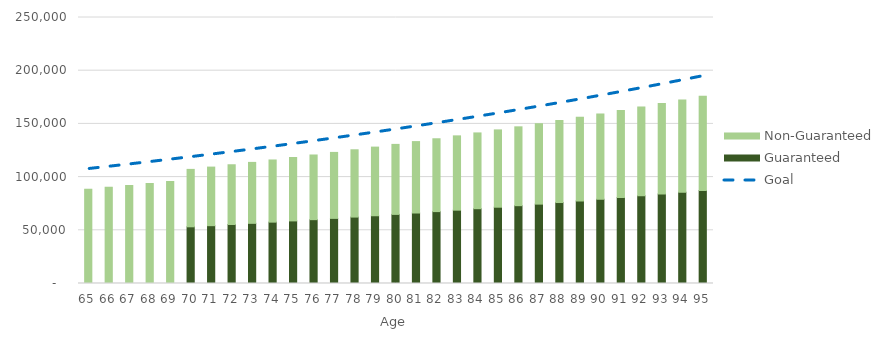
| Category | Guaranteed | Non-Guaranteed |
|---|---|---|
| 65.0 | 0 | 88602.763 |
| 66.0 | 0 | 90374.819 |
| 67.0 | 0 | 92182.315 |
| 68.0 | 0 | 94025.961 |
| 69.0 | 0 | 95906.48 |
| 70.0 | 53280.13 | 53979.62 |
| 71.0 | 54345.732 | 55059.212 |
| 72.0 | 55432.647 | 56160.396 |
| 73.0 | 56541.3 | 57283.604 |
| 74.0 | 57672.126 | 58429.276 |
| 75.0 | 58825.569 | 59597.862 |
| 76.0 | 60002.08 | 60789.819 |
| 77.0 | 61202.122 | 62005.616 |
| 78.0 | 62426.164 | 63245.728 |
| 79.0 | 63674.687 | 64510.643 |
| 80.0 | 64948.181 | 65800.855 |
| 81.0 | 66247.145 | 67116.872 |
| 82.0 | 67572.087 | 68459.21 |
| 83.0 | 68923.529 | 69828.394 |
| 84.0 | 70302 | 71224.962 |
| 85.0 | 71708.04 | 72649.461 |
| 86.0 | 73142.201 | 74102.45 |
| 87.0 | 74605.045 | 75584.499 |
| 88.0 | 76097.146 | 77096.189 |
| 89.0 | 77619.088 | 78638.113 |
| 90.0 | 79171.47 | 80210.876 |
| 91.0 | 80754.9 | 81815.093 |
| 92.0 | 82369.998 | 83451.395 |
| 93.0 | 84017.398 | 85120.423 |
| 94.0 | 85697.745 | 86822.831 |
| 95.0 | 87411.7 | 88559.288 |